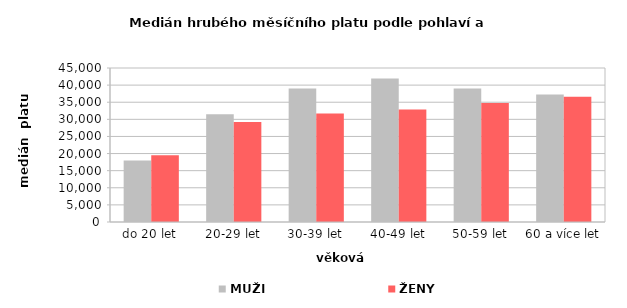
| Category | MUŽI | ŽENY |
|---|---|---|
| 0 | 17936.392 | 19496.5 |
| 1 | 31503.37 | 29194.354 |
| 2 | 39037.929 | 31691.941 |
| 3 | 41946.802 | 32847.75 |
| 4 | 39030.982 | 34737.604 |
| 5 | 37240.284 | 36564.608 |